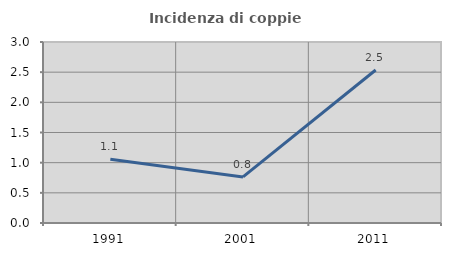
| Category | Incidenza di coppie miste |
|---|---|
| 1991.0 | 1.058 |
| 2001.0 | 0.763 |
| 2011.0 | 2.535 |